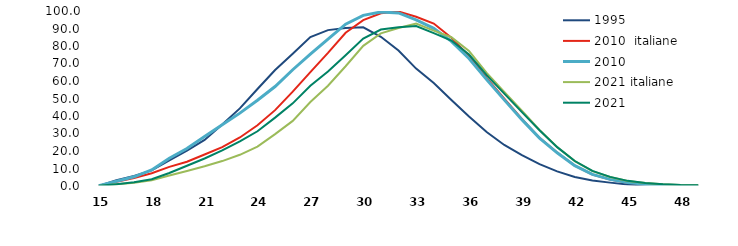
| Category | 1995 | 2010  italiane | 2010 | 2021 italiane | 2021 |
|---|---|---|---|---|---|
| 15.0 | 0.095 | 0.103 | 0.11 | 0.067 | 0.076 |
| 16.0 | 3.259 | 2.418 | 2.727 | 0.936 | 0.997 |
| 17.0 | 5.793 | 4.523 | 5.251 | 1.912 | 2.106 |
| 18.0 | 8.886 | 7.28 | 9.16 | 3.311 | 3.873 |
| 19.0 | 14.616 | 10.955 | 15.862 | 5.976 | 7.404 |
| 20.0 | 20.164 | 13.872 | 21.418 | 8.617 | 11.547 |
| 21.0 | 26.346 | 17.998 | 28.323 | 11.269 | 15.716 |
| 22.0 | 35.108 | 22.257 | 34.958 | 14.245 | 20.333 |
| 23.0 | 44.355 | 27.723 | 41.634 | 17.831 | 25.488 |
| 24.0 | 55.441 | 34.682 | 48.993 | 22.483 | 31.281 |
| 25.0 | 66.314 | 43.351 | 56.846 | 29.672 | 39.07 |
| 26.0 | 75.613 | 53.906 | 66.435 | 37.208 | 47.234 |
| 27.0 | 85.073 | 65.114 | 75.339 | 47.967 | 57.244 |
| 28.0 | 89.077 | 76.09 | 83.982 | 57.313 | 65.456 |
| 29.0 | 90.318 | 87.582 | 92.458 | 68.422 | 74.757 |
| 30.0 | 90.687 | 94.807 | 97.495 | 80.109 | 84.288 |
| 31.0 | 85.274 | 98.743 | 99.44 | 87.194 | 89.381 |
| 32.0 | 77.401 | 99.709 | 98.877 | 90.296 | 90.765 |
| 33.0 | 67.076 | 96.707 | 94.908 | 92.795 | 91.405 |
| 34.0 | 58.83 | 92.829 | 90.057 | 88.792 | 87.358 |
| 35.0 | 49.12 | 84.688 | 82.672 | 85.033 | 83.095 |
| 36.0 | 39.721 | 74.343 | 72.872 | 77.185 | 75.148 |
| 37.0 | 30.828 | 61.761 | 60.854 | 64.611 | 63.337 |
| 38.0 | 23.467 | 49.968 | 49.208 | 53.789 | 52.783 |
| 39.0 | 17.652 | 38.304 | 37.92 | 43.036 | 42.227 |
| 40.0 | 12.499 | 27.517 | 27.388 | 32.027 | 31.889 |
| 41.0 | 8.371 | 19.126 | 18.973 | 22.281 | 22.215 |
| 42.0 | 5.187 | 11.654 | 11.631 | 14.258 | 14.267 |
| 43.0 | 3.195 | 6.563 | 6.643 | 8.458 | 8.643 |
| 44.0 | 1.93 | 3.646 | 3.772 | 5.127 | 5.197 |
| 45.0 | 0.818 | 1.895 | 1.932 | 2.895 | 2.939 |
| 46.0 | 0.295 | 0.967 | 0.987 | 1.769 | 1.774 |
| 47.0 | 0.17 | 0.553 | 0.552 | 1.052 | 1.058 |
| 48.0 | 0.049 | 0.303 | 0.291 | 0.62 | 0.611 |
| 49.0 | 0.014 | 0.192 | 0.19 | 0.418 | 0.4 |